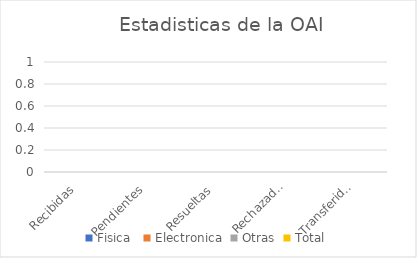
| Category | Fisica  | Electronica | Otras | Total |
|---|---|---|---|---|
| Recibidas | 0 | 0 | 0 | 0 |
| Pendientes | 0 | 0 | 0 | 0 |
| Resueltas | 0 | 0 | 0 | 0 |
| Rechazadas | 0 | 0 | 0 | 0 |
| Transferidas | 0 | 0 | 0 | 0 |